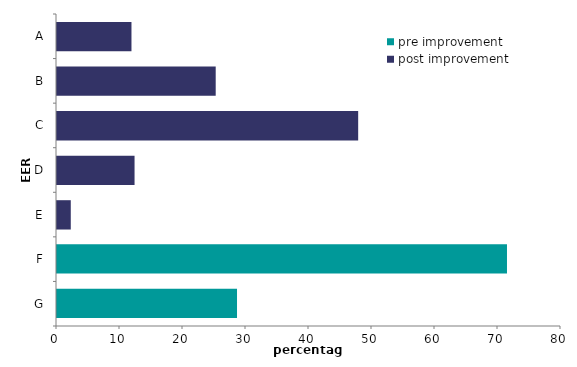
| Category | pre improvement | post improvement |
|---|---|---|
| A | 0 | 11.821 |
| B | 0 | 25.191 |
| C | 0 | 47.805 |
| D | 0 | 12.31 |
| E | 0 | 2.186 |
| F | 71.427 | 0 |
| G | 28.573 | 0 |